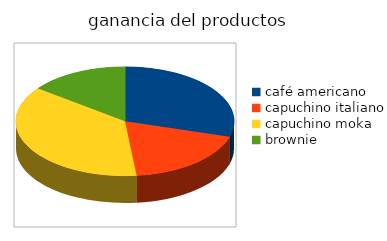
| Category | Series 0 |
|---|---|
| café americano | 892.5 |
| capuchino italiano | 563.5 |
| capuchino moka | 1117.2 |
| brownie | 441 |